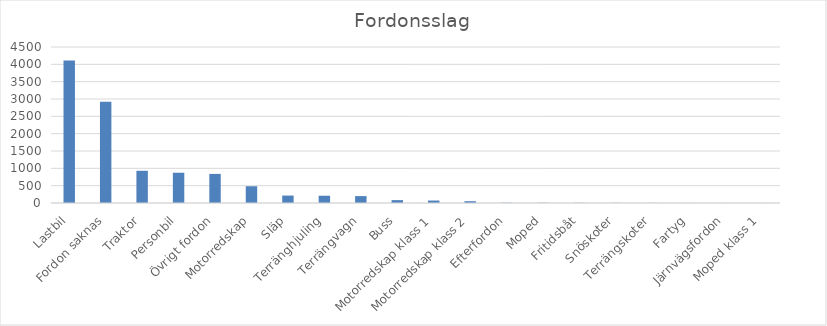
| Category | Summa |
|---|---|
| Lastbil | 4110 |
| Fordon saknas | 2919 |
| Traktor | 929 |
| Personbil | 873 |
| Övrigt fordon | 839 |
| Motorredskap | 483 |
| Släp | 214 |
| Terränghjuling | 210 |
| Terrängvagn | 199 |
| Buss | 83 |
| Motorredskap klass 1 | 71 |
| Motorredskap klass 2 | 52 |
| Efterfordon | 8 |
| Moped | 6 |
| Fritidsbåt | 5 |
| Snöskoter | 4 |
| Terrängskoter | 3 |
| Fartyg | 2 |
| Järnvägsfordon | 1 |
| Moped klass 1 | 1 |